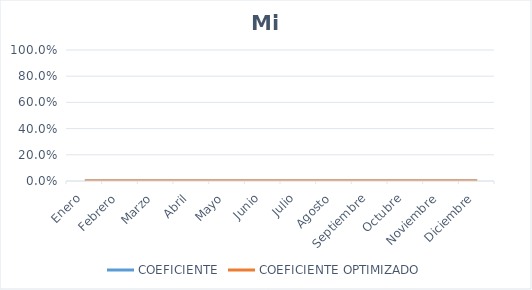
| Category | COEFICIENTE | COEFICIENTE OPTIMIZADO |
|---|---|---|
| Enero | 0 | 0 |
| Febrero | 0 | 0 |
| Marzo | 0 | 0 |
| Abril | 0 | 0 |
| Mayo | 0 | 0 |
| Junio | 0 | 0 |
| Julio | 0 | 0 |
| Agosto | 0 | 0 |
| Septiembre | 0 | 0 |
| Octubre | 0 | 0 |
| Noviembre | 0 | 0 |
| Diciembre | 0 | 0 |